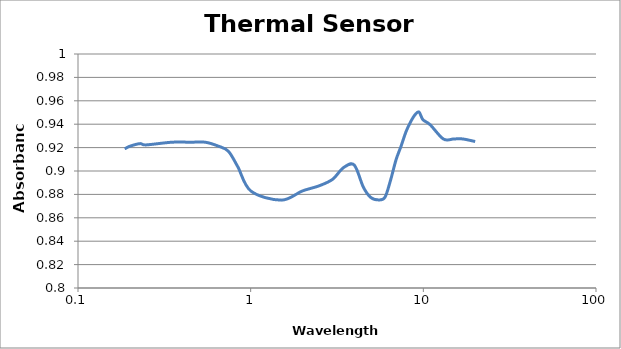
| Category | Absorbance |
|---|---|
| 0.1865 | 0.919 |
| 0.1991 | 0.921 |
| 0.2288 | 0.923 |
| 0.2477 | 0.922 |
| 0.3495 | 0.925 |
| 0.4492 | 0.925 |
| 0.5461 | 0.925 |
| 0.6486 | 0.921 |
| 0.7423 | 0.917 |
| 0.8417 | 0.904 |
| 1.0044 | 0.883 |
| 1.5053 | 0.875 |
| 1.9897 | 0.883 |
| 2.4872 | 0.887 |
| 2.9817 | 0.893 |
| 3.4439 | 0.903 |
| 3.9779 | 0.905 |
| 4.4895 | 0.886 |
| 4.9502 | 0.878 |
| 5.4835 | 0.875 |
| 5.99 | 0.878 |
| 6.4522 | 0.892 |
| 6.95 | 0.91 |
| 7.4517 | 0.922 |
| 7.9525 | 0.934 |
| 8.487 | 0.943 |
| 8.9739 | 0.948 |
| 9.4447 | 0.95 |
| 9.9407 | 0.944 |
| 10.9607 | 0.94 |
| 13.08 | 0.927 |
| 15.038 | 0.927 |
| 16.8919 | 0.927 |
| 19.97 | 0.925 |